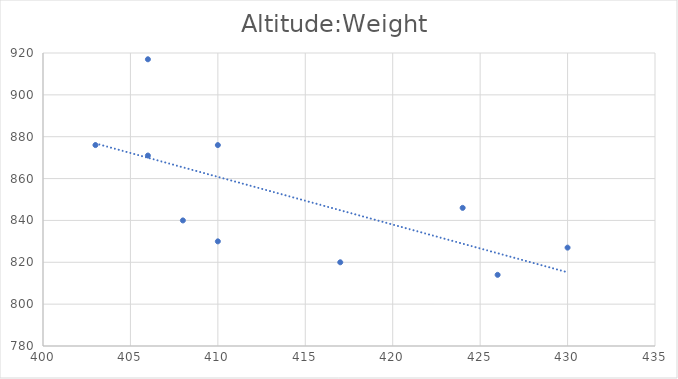
| Category | Green Rocket |
|---|---|
| 426.0 | 814 |
| 417.0 | 820 |
| 410.0 | 830 |
| 403.0 | 876 |
| 408.0 | 840 |
| 406.0 | 871 |
| 410.0 | 876 |
| 406.0 | 917 |
| 430.0 | 827 |
| 424.0 | 846 |